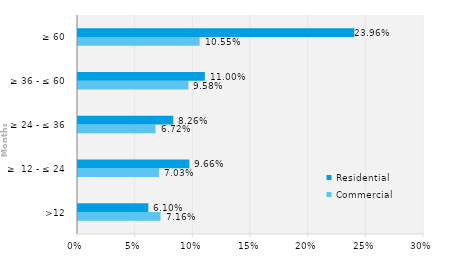
| Category | Commercial | Residential |
|---|---|---|
| >12 | 0.072 | 0.061 |
| ≥  12 - ≤ 24 | 0.07 | 0.097 |
| ≥ 24 - ≤ 36 | 0.067 | 0.083 |
| ≥ 36 - ≤ 60 | 0.096 | 0.11 |
| ≥ 60 | 0.105 | 0.24 |